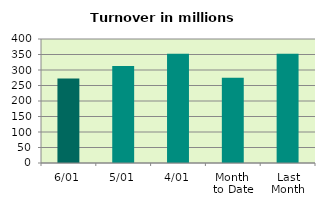
| Category | Series 0 |
|---|---|
| 6/01 | 272.49 |
| 5/01 | 313.241 |
| 4/01 | 352.752 |
| Month 
to Date | 275.19 |
| Last
Month | 352.227 |